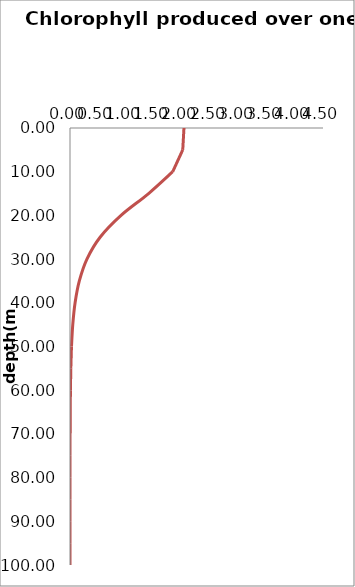
| Category | Profile 2 |
|---|---|
| 2.027141575111103 | 0 |
| 2.005309563990628 | 5 |
| 1.8269185960537855 | 10 |
| 1.3977896528885227 | 15 |
| 0.9079328116421364 | 20 |
| 0.5352169141013277 | 25 |
| 0.30117405702981825 | 30 |
| 0.16595966163841247 | 35 |
| 0.09057586874751555 | 40 |
| 0.049206430970966775 | 45 |
| 0.026670490413547743 | 50 |
| 0.014438570581023491 | 55 |
| 0.007811705889278819 | 60 |
| 0.004224963589834818 | 65 |
| 0.002284664999776531 | 70 |
| 0.001235322525205973 | 75 |
| 0.000667906529717488 | 80 |
| 0.0003611094619615507 | 85 |
| 0.00019523401380450167 | 90 |
| 0.00010555250643573544 | 95 |
| 5.706629806878638e-05 | 100 |